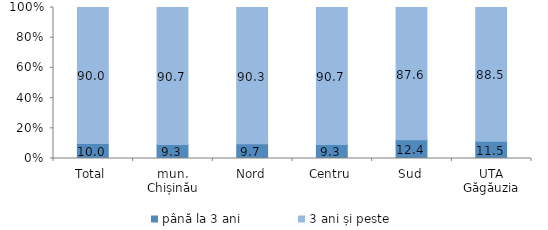
| Category | până la 3 ani | 3 ani și peste |
|---|---|---|
| Total | 10 | 90 |
| mun. Chișinău | 9.3 | 90.7 |
| Nord | 9.7 | 90.3 |
| Centru | 9.3 | 90.7 |
| Sud | 12.4 | 87.6 |
| UTA Găgăuzia | 11.5 | 88.5 |